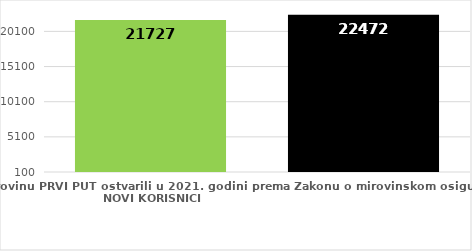
| Category | broj korisnika |
|---|---|
| Korisnici koji su pravo na mirovinu PRVI PUT ostvarili u 2021. godini prema Zakonu o mirovinskom osiguranju - NOVI KORISNICI | 21727 |
| Korisnici mirovina kojima je u 2021. godini PRESTALO PRAVO NA MIROVINU - uzrok smrt 
koji su pravo na mirovinu ostvarili prema Zakonu o mirovinskom osiguranju | 22472 |